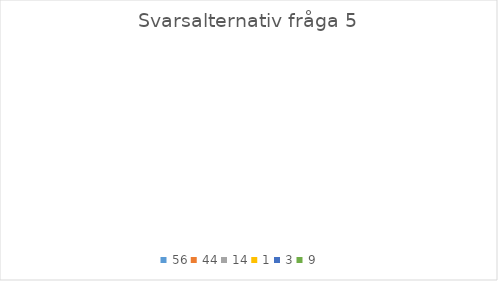
| Category | Svarsalternativ fråga 5 |
|---|---|
| 56.0 | 0 |
| 44.0 | 0 |
| 14.0 | 0 |
| 1.0 | 0 |
| 3.0 | 0 |
| 9.0 | 0 |